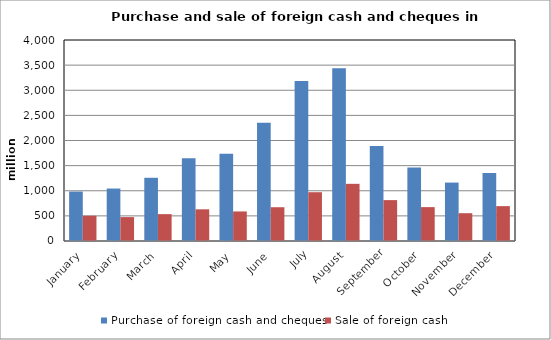
| Category | Purchase of foreign cash and cheques | Sale of foreign cash  |
|---|---|---|
| January | 983632451 | 502354043 |
| February | 1043876345 | 475695046 |
| March | 1258009087 | 534436305 |
| April | 1648793653 | 630432220 |
| May | 1735914139 | 588000134 |
| June | 2351769008 | 672157331 |
| July | 3184671364 | 970840265 |
| August | 3439273059 | 1137537773 |
| September | 1891177583 | 813811778 |
| October | 1462884708 | 674201586 |
| November | 1162600205 | 553108513 |
| December | 1355422939 | 693839699 |